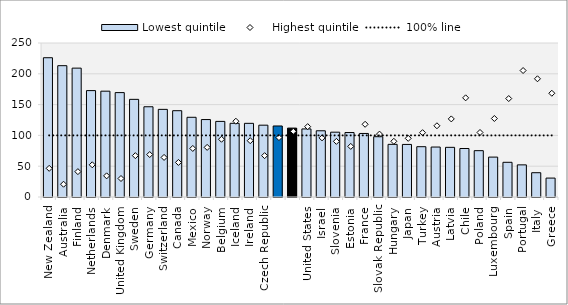
| Category | Lowest quintile |
|---|---|
| New Zealand | 226.101 |
| Australia | 213.175 |
| Finland | 209.195 |
| Netherlands | 172.727 |
| Denmark | 171.789 |
| United Kingdom | 169.474 |
| Sweden | 158.528 |
| Germany | 146.506 |
| Switzerland | 142.263 |
| Canada | 140.096 |
| Mexico | 129.39 |
| Norway | 125.716 |
| Belgium | 122.722 |
| Iceland | 119.632 |
| Ireland | 119.579 |
| Czech Republic | 116.599 |
|  | 115.309 |
|  | 111.85 |
| United States | 110.505 |
| Israel | 107.519 |
| Slovenia | 105.22 |
| Estonia | 104.65 |
| France | 103.136 |
| Slovak Republic | 97.894 |
| Hungary | 85.47 |
| Japan | 85.338 |
| Turkey | 81.671 |
| Austria | 81.098 |
| Latvia | 80.614 |
| Chile | 78.717 |
| Poland | 75.216 |
| Luxembourg | 64.782 |
| Spain | 56.327 |
| Portugal | 52.165 |
| Italy | 39.442 |
| Greece | 30.706 |